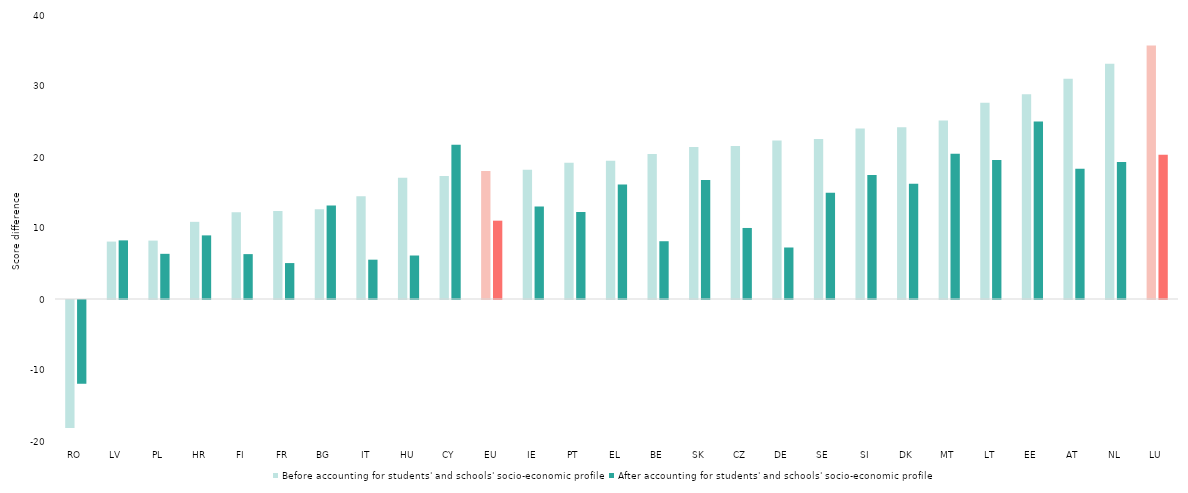
| Category | Before accounting for students' and schools' socio-economic profile | After accounting for students' and schools' socio-economic profile |
|---|---|---|
| RO | -18.038 | -11.797 |
| LV | 8.086 | 8.258 |
| PL | 8.225 | 6.362 |
| HR | 10.867 | 8.96 |
| FI | 12.211 | 6.322 |
| FR | 12.397 | 5.06 |
| BG | 12.657 | 13.174 |
| IT | 14.487 | 5.538 |
| HU | 17.092 | 6.126 |
| CY | 17.308 | 21.731 |
| EU | 18.032 | 11.031 |
| IE | 18.198 | 13.029 |
| PT | 19.177 | 12.253 |
| EL | 19.488 | 16.127 |
| BE | 20.439 | 8.137 |
| SK | 21.397 | 16.775 |
| CZ | 21.534 | 10.005 |
| DE | 22.315 | 7.254 |
| SE | 22.519 | 14.958 |
| SI | 24.017 | 17.481 |
| DK | 24.203 | 16.237 |
| MT | 25.144 | 20.453 |
| LT | 27.64 | 19.593 |
| EE | 28.836 | 24.998 |
| AT | 31.024 | 18.349 |
| NL | 33.134 | 19.29 |
| LU | 35.709 | 20.332 |